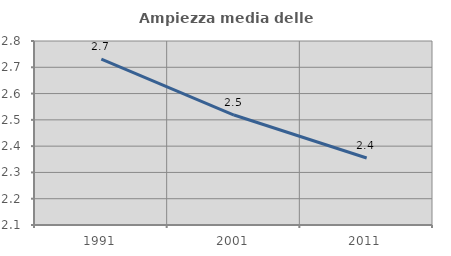
| Category | Ampiezza media delle famiglie |
|---|---|
| 1991.0 | 2.731 |
| 2001.0 | 2.518 |
| 2011.0 | 2.355 |